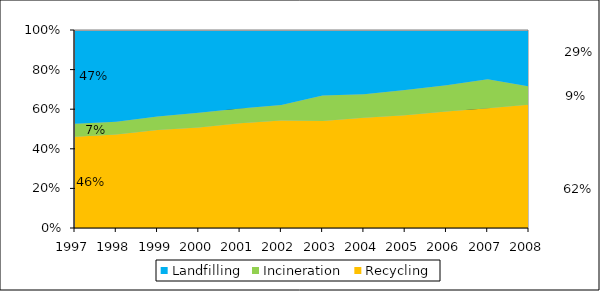
| Category | Recycling | Incineration | Landfilling |
|---|---|---|---|
| 1997.0 | 0.46 | 0.065 | 0.474 |
| 1998.0 | 0.473 | 0.064 | 0.463 |
| 1999.0 | 0.495 | 0.068 | 0.437 |
| 2000.0 | 0.508 | 0.074 | 0.418 |
| 2001.0 | 0.529 | 0.075 | 0.397 |
| 2002.0 | 0.543 | 0.078 | 0.379 |
| 2003.0 | 0.541 | 0.128 | 0.331 |
| 2004.0 | 0.556 | 0.119 | 0.325 |
| 2005.0 | 0.57 | 0.127 | 0.303 |
| 2006.0 | 0.589 | 0.133 | 0.278 |
| 2007.0 | 0.605 | 0.146 | 0.249 |
| 2008.0 | 0.623 | 0.091 | 0.285 |